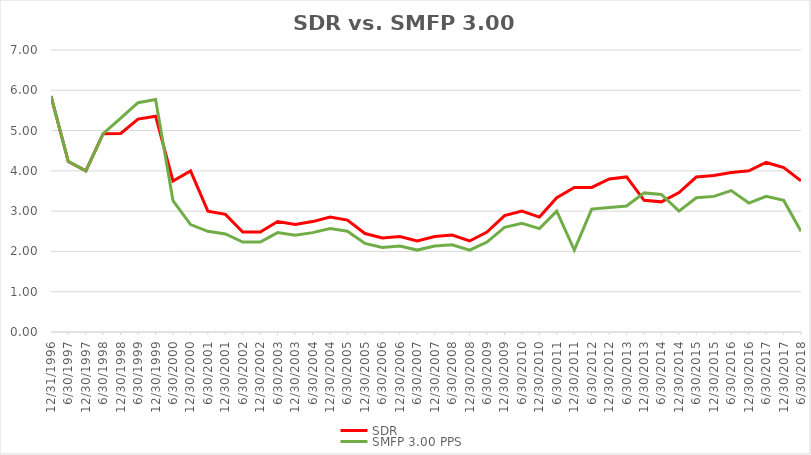
| Category | SDR | SMFP 3.00 PPS |
|---|---|---|
| 12/31/96 | 5.857 | 5.857 |
| 6/30/97 | 4.231 | 4.231 |
| 12/31/97 | 4 | 4 |
| 6/30/98 | 4.923 | 4.923 |
| 12/31/98 | 4.929 | 5.308 |
| 6/30/99 | 5.286 | 5.692 |
| 12/31/99 | 5.357 | 5.769 |
| 6/30/00 | 3.75 | 3.261 |
| 12/31/00 | 4 | 2.667 |
| 6/30/01 | 3 | 2.5 |
| 12/31/01 | 2.92 | 2.433 |
| 6/30/02 | 2.481 | 2.233 |
| 12/31/02 | 2.481 | 2.233 |
| 6/30/03 | 2.741 | 2.467 |
| 12/31/03 | 2.667 | 2.4 |
| 6/30/04 | 2.741 | 2.467 |
| 12/31/04 | 2.852 | 2.567 |
| 6/30/05 | 2.778 | 2.5 |
| 12/31/05 | 2.444 | 2.2 |
| 6/30/06 | 2.333 | 2.1 |
| 12/31/06 | 2.37 | 2.133 |
| 6/30/07 | 2.259 | 2.033 |
| 12/31/07 | 2.37 | 2.133 |
| 6/30/08 | 2.407 | 2.167 |
| 12/31/08 | 2.259 | 2.033 |
| 6/30/09 | 2.481 | 2.233 |
| 12/31/09 | 2.889 | 2.6 |
| 6/30/10 | 3 | 2.7 |
| 12/31/10 | 2.852 | 2.567 |
| 6/30/11 | 3.333 | 3 |
| 12/31/11 | 3.588 | 2.033 |
| 6/30/12 | 3.588 | 3.05 |
| 12/31/12 | 3.8 | 3.088 |
| 6/30/13 | 3.85 | 3.128 |
| 12/31/13 | 3.269 | 3.453 |
| 6/30/14 | 3.231 | 3.412 |
| 12/31/14 | 3.462 | 3 |
| 6/30/15 | 3.846 | 3.333 |
| 12/31/15 | 3.885 | 3.367 |
| 6/30/16 | 3.958 | 3.51 |
| 12/31/16 | 4 | 3.2 |
| 6/30/17 | 4.208 | 3.367 |
| 12/31/17 | 4.083 | 3.267 |
| 6/30/18 | 3.75 | 2.5 |